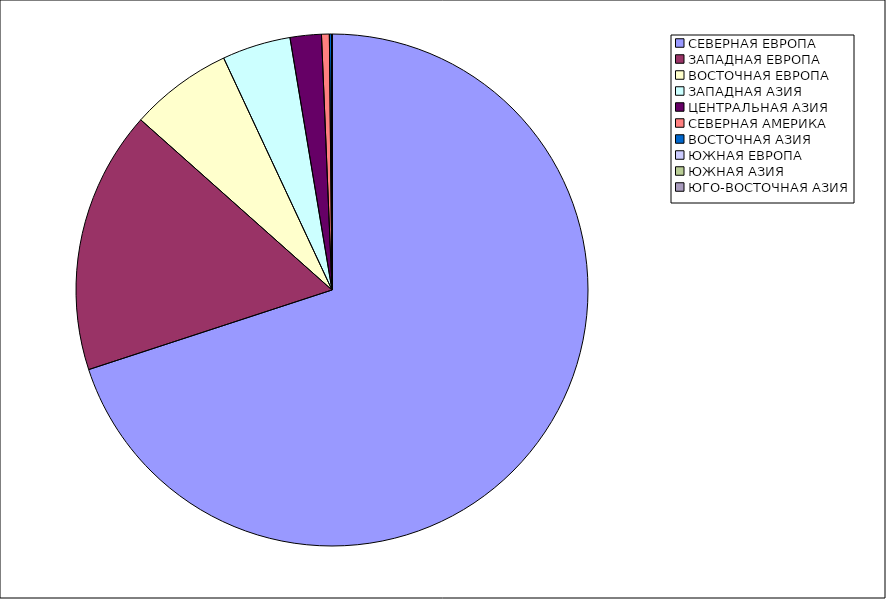
| Category | Оборот |
|---|---|
| СЕВЕРНАЯ ЕВРОПА | 69.967 |
| ЗАПАДНАЯ ЕВРОПА | 16.604 |
| ВОСТОЧНАЯ ЕВРОПА | 6.474 |
| ЗАПАДНАЯ АЗИЯ | 4.326 |
| ЦЕНТРАЛЬНАЯ АЗИЯ | 1.972 |
| СЕВЕРНАЯ АМЕРИКА | 0.491 |
| ВОСТОЧНАЯ АЗИЯ | 0.145 |
| ЮЖНАЯ ЕВРОПА | 0.019 |
| ЮЖНАЯ АЗИЯ | 0.001 |
| ЮГО-ВОСТОЧНАЯ АЗИЯ | 0 |